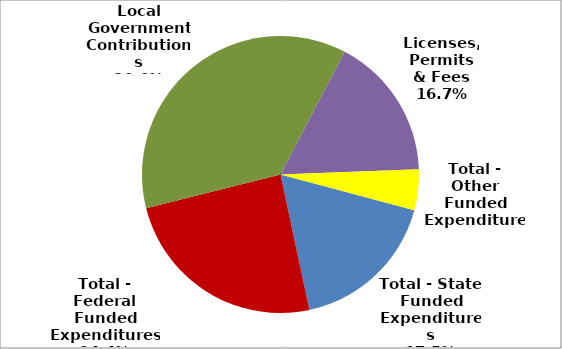
| Category | Series 0 |
|---|---|
| Total - State Funded Expenditures | 379012 |
| Total - Federal Funded Expenditures | 529732 |
| Local Government Contributions | 793390 |
| Licenses, Permits & Fees | 362864 |
| Total - Other Funded Expenditures | 103274 |